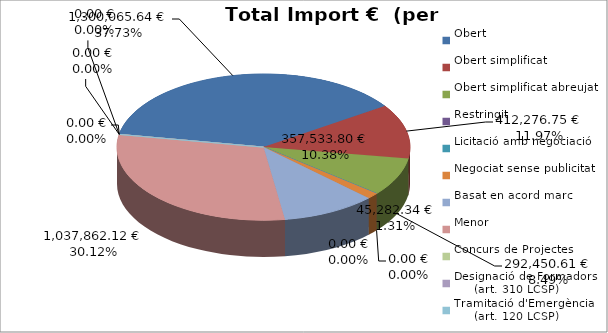
| Category | Total preu
(amb IVA) |
|---|---|
| Obert | 1300065.64 |
| Obert simplificat | 412276.75 |
| Obert simplificat abreujat | 292450.61 |
| Restringit | 0 |
| Licitació amb negociació | 0 |
| Negociat sense publicitat | 45282.34 |
| Basat en acord marc | 357533.8 |
| Menor | 1037862.12 |
| Concurs de Projectes | 0 |
| Designació de Formadors
     (art. 310 LCSP) | 0 |
| Tramitació d'Emergència
     (art. 120 LCSP) | 0 |